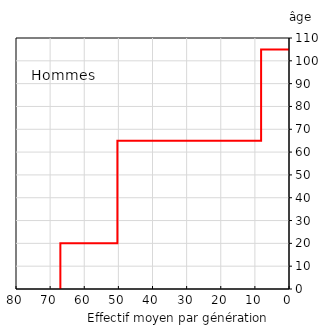
| Category | Hommes |
|---|---|
| -67.0 | 0 |
| -67.0 | 20 |
| -50.28888888888889 | 20 |
| -50.28888888888889 | 65 |
| -8.175 | 65 |
| -8.175 | 105 |
| 0.0 | 105 |